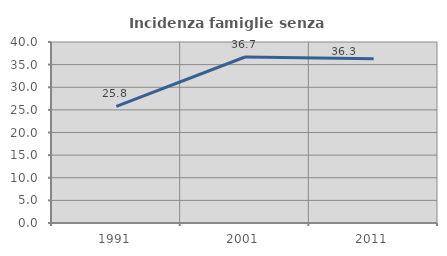
| Category | Incidenza famiglie senza nuclei |
|---|---|
| 1991.0 | 25.758 |
| 2001.0 | 36.685 |
| 2011.0 | 36.275 |